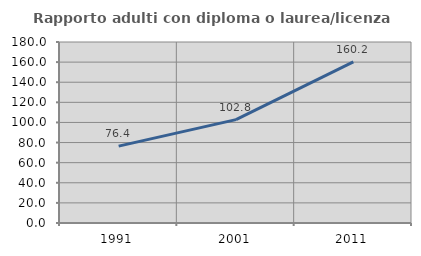
| Category | Rapporto adulti con diploma o laurea/licenza media  |
|---|---|
| 1991.0 | 76.419 |
| 2001.0 | 102.803 |
| 2011.0 | 160.218 |